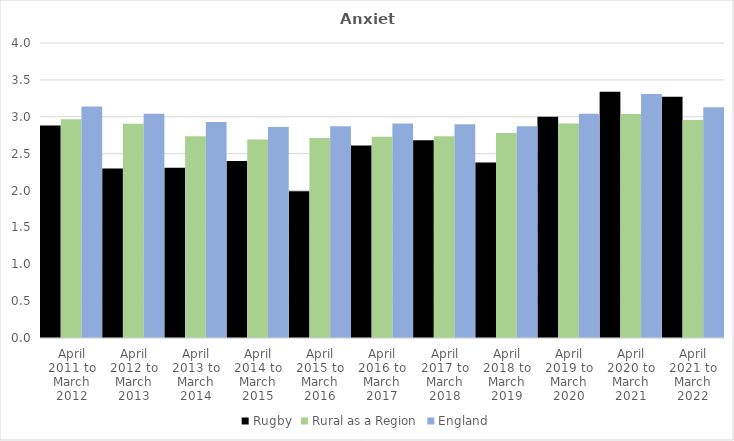
| Category | Rugby | Rural as a Region | England |
|---|---|---|---|
| April 2011 to March 2012 | 2.88 | 2.967 | 3.14 |
| April 2012 to March 2013 | 2.3 | 2.904 | 3.04 |
| April 2013 to March 2014 | 2.31 | 2.734 | 2.93 |
| April 2014 to March 2015 | 2.4 | 2.691 | 2.86 |
| April 2015 to March 2016 | 1.99 | 2.711 | 2.87 |
| April 2016 to March 2017 | 2.61 | 2.729 | 2.91 |
| April 2017 to March 2018 | 2.68 | 2.736 | 2.9 |
| April 2018 to March 2019 | 2.38 | 2.78 | 2.87 |
| April 2019 to March 2020 | 3 | 2.908 | 3.04 |
| April 2020 to March 2021 | 3.34 | 3.036 | 3.31 |
| April 2021 to March 2022 | 3.27 | 2.956 | 3.13 |